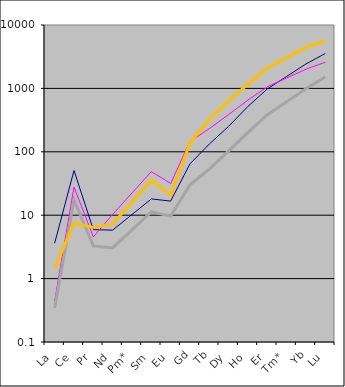
| Category | Series 0 | Series 1 | Series 2 | Series 3 |
|---|---|---|---|---|
| La | 3.627 | 0.441 | 0.344 | 1.447 |
| Ce | 50.694 | 27.809 | 17.372 | 7.547 |
| Pr | 5.917 | 4.54 | 3.281 | 6.401 |
| Nd | 5.814 | 10.318 | 3.051 | 7.287 |
| Pm* | 10.249 | 22.42 | 5.868 | 16.138 |
| Sm | 18.065 | 48.716 | 11.288 | 35.74 |
| Eu | 16.698 | 31.706 | 9.676 | 21.021 |
| Gd | 64.707 | 146.191 | 30.139 | 137.283 |
| Tb | 132.553 | 232.148 | 53.265 | 326.184 |
| Dy | 252.259 | 387.149 | 103.151 | 635.27 |
| Ho | 521.079 | 656.106 | 202.254 | 1166.413 |
| Er | 980.224 | 1059.103 | 384.186 | 2096.929 |
| Tm* | 1543.54 | 1458.769 | 616.528 | 3049.835 |
| Yb | 2430.582 | 2009.256 | 989.382 | 4435.77 |
| Lu | 3559.111 | 2587.721 | 1523.368 | 5647.354 |